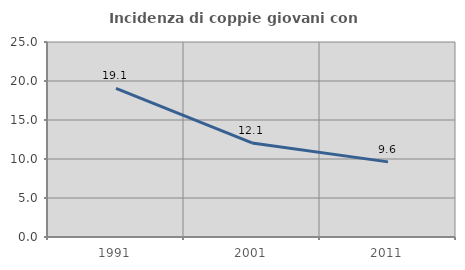
| Category | Incidenza di coppie giovani con figli |
|---|---|
| 1991.0 | 19.061 |
| 2001.0 | 12.063 |
| 2011.0 | 9.631 |